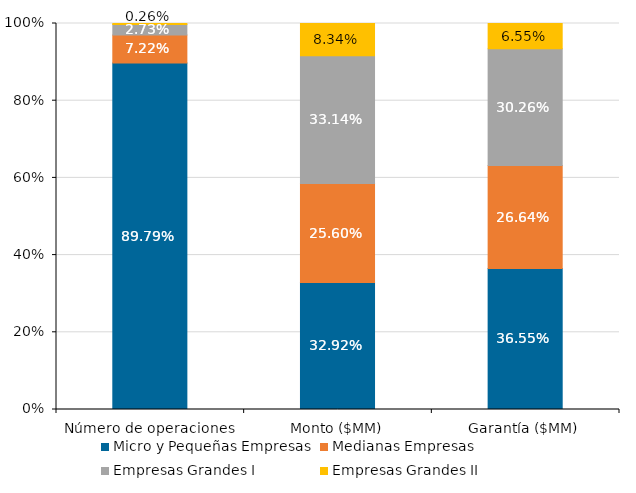
| Category | Micro y Pequeñas Empresas | Medianas Empresas | Empresas Grandes I | Empresas Grandes II |
|---|---|---|---|---|
| Número de operaciones | 0.898 | 0.072 | 0.027 | 0.003 |
| Monto ($MM) | 0.329 | 0.256 | 0.331 | 0.083 |
| Garantía ($MM) | 0.365 | 0.266 | 0.303 | 0.065 |